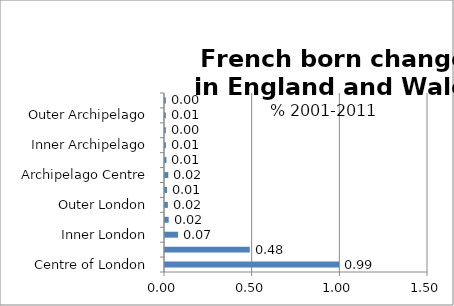
| Category | Series 0 |
|---|---|
| Centre of London | 0.992 |
| London Core | 0.484 |
| Inner London | 0.075 |
| London Suburbs | 0.021 |
| Outer London | 0.016 |
| London Edge | 0.012 |
| Archipelago Centre | 0.019 |
| Archipelago Core | 0.008 |
| Inner Archipelago | 0.005 |
| Archipelago Suburbs | 0.005 |
| Outer Archipelago | 0.005 |
| Archipelago Edge | 0.005 |